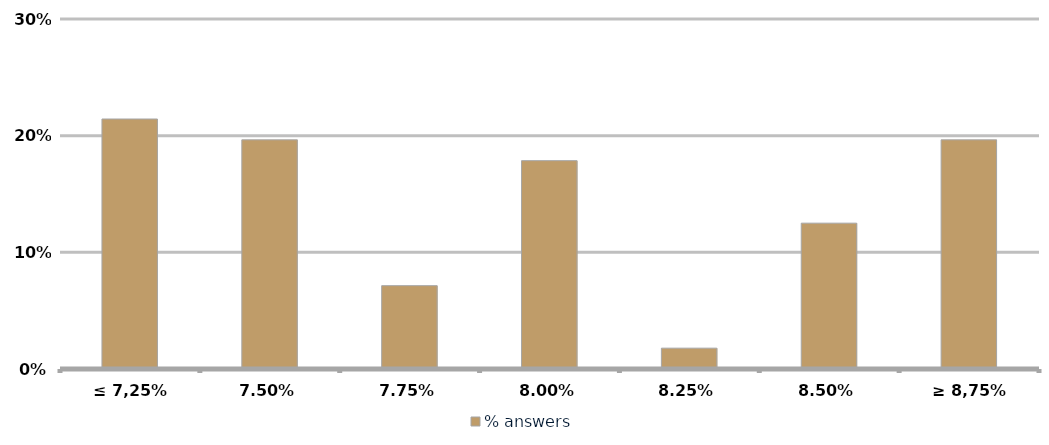
| Category | % answers |
|---|---|
| ≤ 7,25% | 0.214 |
| 7,50% | 0.196 |
| 7,75% | 0.071 |
| 8,00% | 0.179 |
| 8,25% | 0.018 |
| 8,50% | 0.125 |
| ≥ 8,75% | 0.196 |